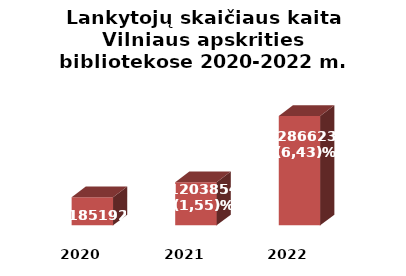
| Category | Series 0 |
|---|---|
| 2020.0 | 1185192 |
| 2021.0 | 1203854 |
| 2022.0 | 1286623 |